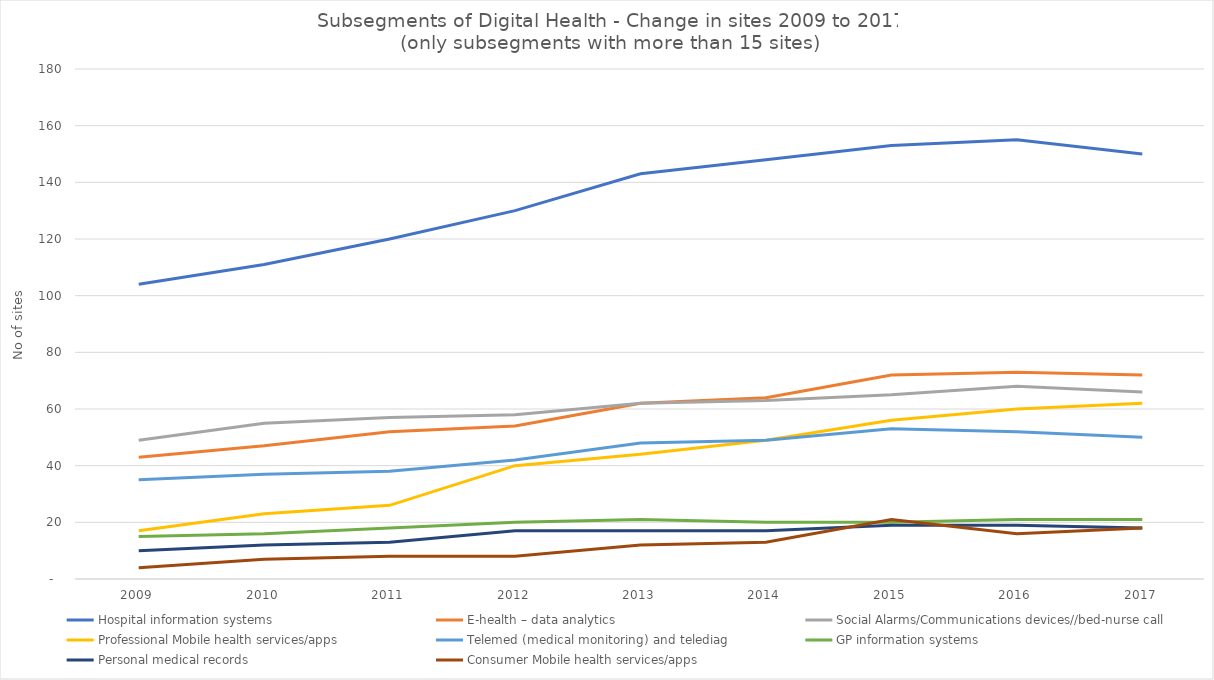
| Category |  Hospital information systems   |  E-health – data analytics  |  Social Alarms/Communications devices//bed-nurse call  |  Professional Mobile health services/apps  |  Telemed (medical monitoring) and telediag   |  GP information systems  |  Personal medical records  |  Consumer Mobile health services/apps  |
|---|---|---|---|---|---|---|---|---|
|  2009  | 104 | 43 | 49 | 17 | 35 | 15 | 10 | 4 |
|  2010  | 111 | 47 | 55 | 23 | 37 | 16 | 12 | 7 |
|  2011  | 120 | 52 | 57 | 26 | 38 | 18 | 13 | 8 |
|  2012  | 130 | 54 | 58 | 40 | 42 | 20 | 17 | 8 |
|  2013  | 143 | 62 | 62 | 44 | 48 | 21 | 17 | 12 |
|  2014  | 148 | 64 | 63 | 49 | 49 | 20 | 17 | 13 |
|  2015  | 153 | 72 | 65 | 56 | 53 | 20 | 19 | 21 |
|  2016  | 155 | 73 | 68 | 60 | 52 | 21 | 19 | 16 |
|  2017  | 150 | 72 | 66 | 62 | 50 | 21 | 18 | 18 |